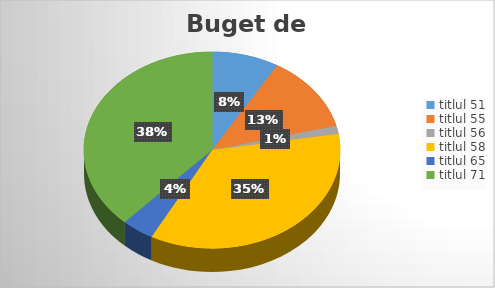
| Category | Series 0 |
|---|---|
| titlul 51 | 1538061 |
| titlul 55 | 2277540 |
| titlul 56 | 244148 |
| titlul 58 | 6436142 |
| titlul 65 | 747064 |
| titlul 71 | 6916985 |